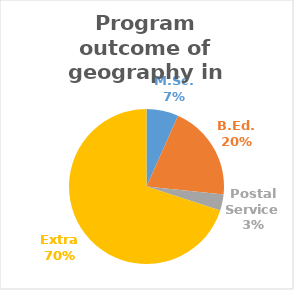
| Category | Series 0 |
|---|---|
| M.Sc. | 2 |
| B.Ed. | 6 |
| Postal Service | 1 |
| Extra | 21 |